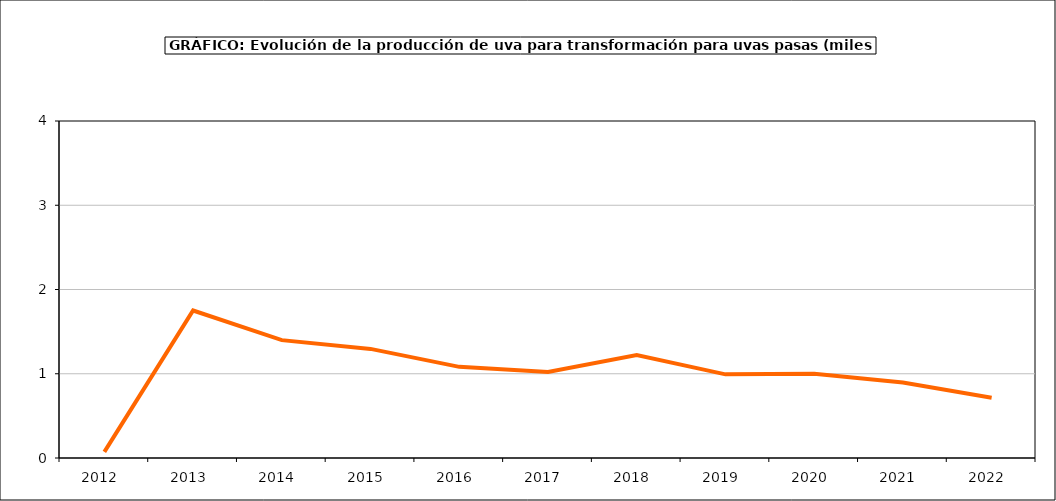
| Category | producción |
|---|---|
| 2012.0 | 0.072 |
| 2013.0 | 1.751 |
| 2014.0 | 1.399 |
| 2015.0 | 1.295 |
| 2016.0 | 1.082 |
| 2017.0 | 1.02 |
| 2018.0 | 1.223 |
| 2019.0 | 0.993 |
| 2020.0 | 0.999 |
| 2021.0 | 0.896 |
| 2022.0 | 0.716 |